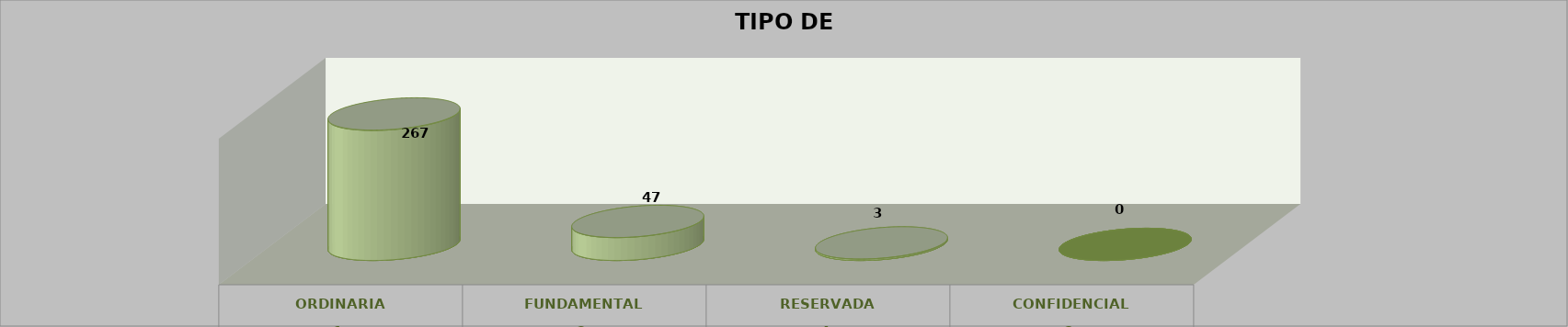
| Category | Series 0 | Series 2 | Series 1 | Series 3 | Series 4 |
|---|---|---|---|---|---|
| 0 |  |  |  | 267 | 0.842 |
| 1 |  |  |  | 47 | 0.148 |
| 2 |  |  |  | 3 | 0.009 |
| 3 |  |  |  | 0 | 0 |